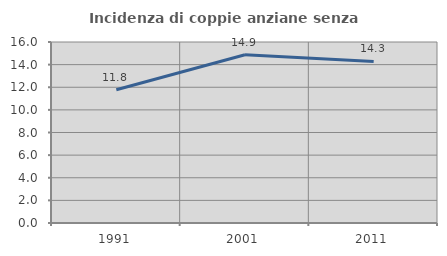
| Category | Incidenza di coppie anziane senza figli  |
|---|---|
| 1991.0 | 11.783 |
| 2001.0 | 14.879 |
| 2011.0 | 14.286 |